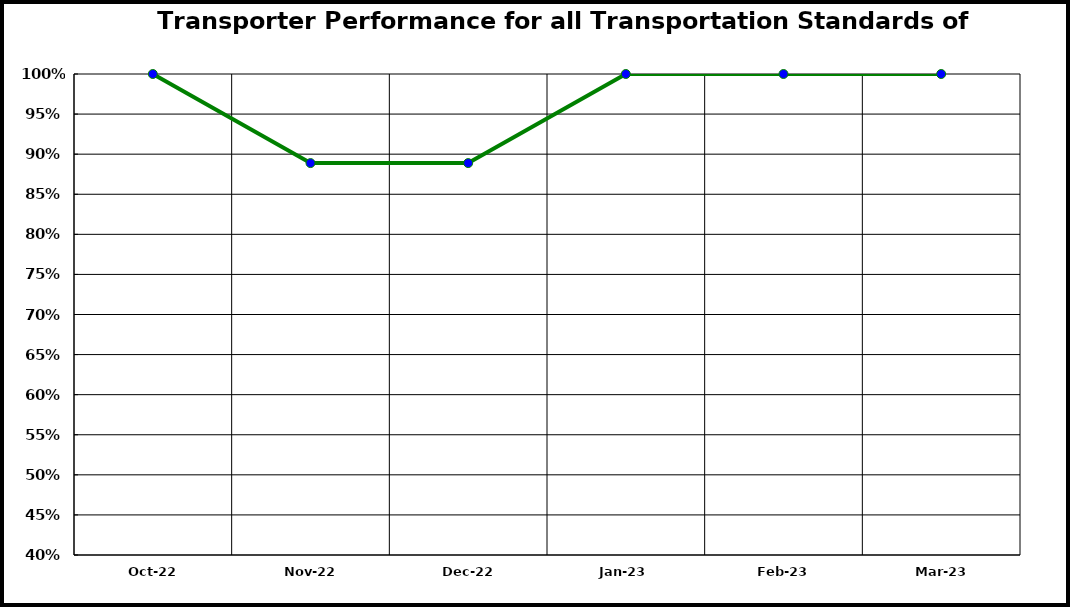
| Category | Performance |
|---|---|
| 2022-10-01 | 1 |
| 2022-11-01 | 0.889 |
| 2022-12-01 | 0.889 |
| 2023-01-01 | 1 |
| 2023-02-01 | 1 |
| 2023-03-01 | 1 |